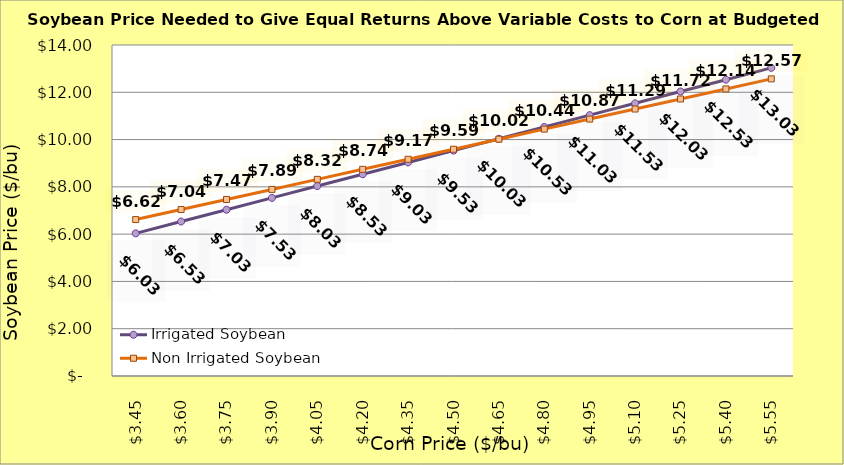
| Category | Irrigated Soybean | Non Irrigated Soybean |
|---|---|---|
| 3.4499999999999993 | 6.033 | 6.617 |
| 3.599999999999999 | 6.533 | 7.042 |
| 3.749999999999999 | 7.033 | 7.467 |
| 3.899999999999999 | 7.533 | 7.892 |
| 4.049999999999999 | 8.033 | 8.317 |
| 4.199999999999999 | 8.533 | 8.742 |
| 4.35 | 9.033 | 9.167 |
| 4.5 | 9.533 | 9.592 |
| 4.65 | 10.033 | 10.017 |
| 4.800000000000001 | 10.533 | 10.442 |
| 4.950000000000001 | 11.033 | 10.867 |
| 5.100000000000001 | 11.533 | 11.292 |
| 5.250000000000002 | 12.033 | 11.717 |
| 5.400000000000002 | 12.533 | 12.142 |
| 5.5500000000000025 | 13.033 | 12.567 |